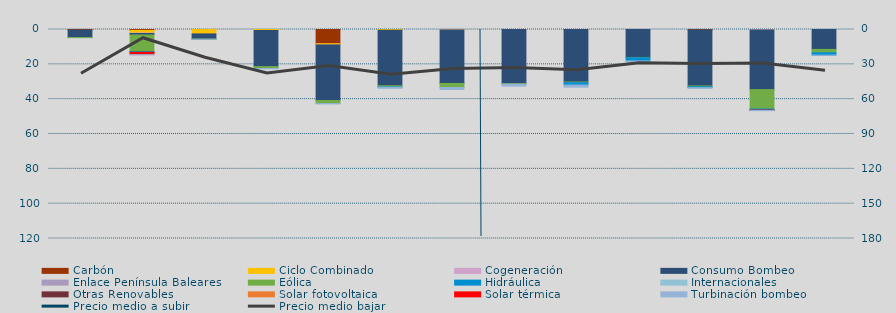
| Category | Carbón | Ciclo Combinado | Cogeneración | Consumo Bombeo | Enlace Península Baleares | Eólica | Hidráulica | Internacionales | Otras Renovables | Solar fotovoltaica | Solar térmica | Turbinación bombeo |
|---|---|---|---|---|---|---|---|---|---|---|---|---|
| 0 | 294.2 | 0 | 0 | 4310.8 | 42.4 | 0.6 | 0 |  | 0 | 0 | 0 | 0 |
| 1 | 516.7 | 1537.9 | 257 | 809.6 | 0 | 9502.9 | 408.7 |  | 117.5 | 0.4 | 1254.7 | 102.9 |
| 2 | 0 | 2533.1 | 0 | 2991.4 | 0 | 42.6 | 0 |  | 0 | 0 | 0 | 65 |
| 3 | 0 | 555.8 | 0 | 20748.5 | 0 | 1071 | 8.2 |  | 0 | 0 | 0 | 183.2 |
| 4 | 8149.5 | 754.8 | 3.5 | 31856.3 | 0 | 1760.6 | 0 |  | 0 | 0 | 0 | 177.8 |
| 5 | 0 | 458.3 | 0 | 31829.7 | 0 | 671.7 | 189.5 |  | 0 | 0 | 0 | 613.5 |
| 6 | 0 | 223.8 | 2.4 | 30752.2 | 0 | 2324.3 | 0 |  | 0 | 0 | 0 | 1135.9 |
| 7 | 0 | 0 | 0 | 31097.5 | 0 | 268.5 | 0 |  | 0 | 0 | 0 | 1121.8 |
| 8 | 0 | 20 | 0 | 30123.6 | 0 | 373.8 | 1416.6 |  | 0 | 0 | 0 | 1190.9 |
| 9 | 0 | 0 | 0 | 16053.6 | 0 | 185.3 | 1837.6 |  | 0 | 0 | 0 | 606.6 |
| 10 | 350.4 | 0 | 0 | 32084.5 | 0 | 425.7 | 531.2 |  | 0 | 0 | 0 | 413.1 |
| 11 | 0 | 90 | 154.4 | 34261.7 | 0 | 11163.7 | 589.5 |  | 122.2 | 0 | 44.1 | 171.5 |
| 12 | 0 | 0 | 0 | 11426.8 | 0 | 1911.2 | 1375.3 |  | 0 | 0 | 0 | 67.5 |